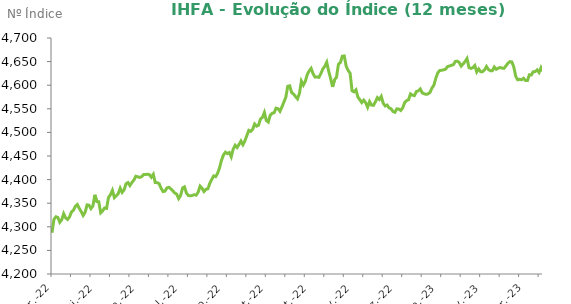
| Category | Series 0 |
|---|---|
| 2022-03-31 | 4287.32 |
| 2022-04-01 | 4315.72 |
| 2022-04-04 | 4321.24 |
| 2022-04-05 | 4319.86 |
| 2022-04-06 | 4309.53 |
| 2022-04-07 | 4315.01 |
| 2022-04-08 | 4327.76 |
| 2022-04-11 | 4318.84 |
| 2022-04-12 | 4315.58 |
| 2022-04-13 | 4320.88 |
| 2022-04-14 | 4331.49 |
| 2022-04-18 | 4335.14 |
| 2022-04-19 | 4343.38 |
| 2022-04-20 | 4347.19 |
| 2022-04-22 | 4339.14 |
| 2022-04-25 | 4332.06 |
| 2022-04-26 | 4324.09 |
| 2022-04-27 | 4330.61 |
| 2022-04-28 | 4346.48 |
| 2022-04-29 | 4345.76 |
| 2022-05-02 | 4338.55 |
| 2022-05-03 | 4344.23 |
| 2022-05-04 | 4367.72 |
| 2022-05-05 | 4353.47 |
| 2022-05-06 | 4353.09 |
| 2022-05-09 | 4329.81 |
| 2022-05-10 | 4333.87 |
| 2022-05-11 | 4339.92 |
| 2022-05-12 | 4339.02 |
| 2022-05-13 | 4362.08 |
| 2022-05-16 | 4367.99 |
| 2022-05-17 | 4377.25 |
| 2022-05-18 | 4361.85 |
| 2022-05-19 | 4365.84 |
| 2022-05-20 | 4370.28 |
| 2022-05-23 | 4381.87 |
| 2022-05-24 | 4372.9 |
| 2022-05-25 | 4378.21 |
| 2022-05-26 | 4391.18 |
| 2022-05-27 | 4393.81 |
| 2022-05-30 | 4387.34 |
| 2022-05-31 | 4393.69 |
| 2022-06-01 | 4398.86 |
| 2022-06-02 | 4407.08 |
| 2022-06-03 | 4405.95 |
| 2022-06-06 | 4404.67 |
| 2022-06-07 | 4406.15 |
| 2022-06-08 | 4410.66 |
| 2022-06-09 | 4410.74 |
| 2022-06-10 | 4411.45 |
| 2022-06-13 | 4410.41 |
| 2022-06-14 | 4404.92 |
| 2022-06-15 | 4411.04 |
| 2022-06-17 | 4393.67 |
| 2022-06-20 | 4393.54 |
| 2022-06-21 | 4391.22 |
| 2022-06-22 | 4381.46 |
| 2022-06-23 | 4374.66 |
| 2022-06-24 | 4375.66 |
| 2022-06-27 | 4382.52 |
| 2022-06-28 | 4383.74 |
| 2022-06-29 | 4380.23 |
| 2022-06-30 | 4376.35 |
| 2022-07-01 | 4371.48 |
| 2022-07-04 | 4369.29 |
| 2022-07-05 | 4359.8 |
| 2022-07-06 | 4366.05 |
| 2022-07-07 | 4382.22 |
| 2022-07-08 | 4384.67 |
| 2022-07-11 | 4371.58 |
| 2022-07-12 | 4366.28 |
| 2022-07-13 | 4365.61 |
| 2022-07-14 | 4366.5 |
| 2022-07-15 | 4367.93 |
| 2022-07-18 | 4366.96 |
| 2022-07-19 | 4373.3 |
| 2022-07-20 | 4386.03 |
| 2022-07-21 | 4381.88 |
| 2022-07-22 | 4374.72 |
| 2022-07-25 | 4379.24 |
| 2022-07-26 | 4380.54 |
| 2022-07-27 | 4392.11 |
| 2022-07-28 | 4400.37 |
| 2022-07-29 | 4407.82 |
| 2022-08-01 | 4406.25 |
| 2022-08-02 | 4413.4 |
| 2022-08-03 | 4425.11 |
| 2022-08-04 | 4441.09 |
| 2022-08-05 | 4452.15 |
| 2022-08-08 | 4458.07 |
| 2022-08-09 | 4454.98 |
| 2022-08-10 | 4457.25 |
| 2022-08-11 | 4448.2 |
| 2022-08-12 | 4464.61 |
| 2022-08-15 | 4472.71 |
| 2022-08-16 | 4468.06 |
| 2022-08-17 | 4474.57 |
| 2022-08-18 | 4481.68 |
| 2022-08-19 | 4473.97 |
| 2022-08-22 | 4482.05 |
| 2022-08-23 | 4493.21 |
| 2022-08-24 | 4504.37 |
| 2022-08-25 | 4502.13 |
| 2022-08-26 | 4506.75 |
| 2022-08-29 | 4517.73 |
| 2022-08-30 | 4513.24 |
| 2022-08-31 | 4515.16 |
| 2022-09-01 | 4528.52 |
| 2022-09-02 | 4531.67 |
| 2022-09-05 | 4542.15 |
| 2022-09-06 | 4525.11 |
| 2022-09-08 | 4521.96 |
| 2022-09-09 | 4536.39 |
| 2022-09-12 | 4540.42 |
| 2022-09-13 | 4541.69 |
| 2022-09-14 | 4551.4 |
| 2022-09-15 | 4550.25 |
| 2022-09-16 | 4544.65 |
| 2022-09-19 | 4553.97 |
| 2022-09-20 | 4564.09 |
| 2022-09-21 | 4574.43 |
| 2022-09-22 | 4597.61 |
| 2022-09-23 | 4598.77 |
| 2022-09-26 | 4584.44 |
| 2022-09-27 | 4581.13 |
| 2022-09-28 | 4575.78 |
| 2022-09-29 | 4571.03 |
| 2022-09-30 | 4582.61 |
| 2022-10-03 | 4608.62 |
| 2022-10-04 | 4600.24 |
| 2022-10-05 | 4608.29 |
| 2022-10-06 | 4622.42 |
| 2022-10-07 | 4630.29 |
| 2022-10-10 | 4635.62 |
| 2022-10-11 | 4624.15 |
| 2022-10-13 | 4617.21 |
| 2022-10-14 | 4617.47 |
| 2022-10-17 | 4616.73 |
| 2022-10-18 | 4624.73 |
| 2022-10-19 | 4634.39 |
| 2022-10-20 | 4640.08 |
| 2022-10-21 | 4648.73 |
| 2022-10-24 | 4629.83 |
| 2022-10-25 | 4614.13 |
| 2022-10-26 | 4596.5 |
| 2022-10-27 | 4611.5 |
| 2022-10-28 | 4616.65 |
| 2022-10-31 | 4644.19 |
| 2022-11-01 | 4648.04 |
| 2022-11-03 | 4661.36 |
| 2022-11-04 | 4661.97 |
| 2022-11-07 | 4640.01 |
| 2022-11-08 | 4631.23 |
| 2022-11-09 | 4625.46 |
| 2022-11-10 | 4588.19 |
| 2022-11-11 | 4585.93 |
| 2022-11-14 | 4590.28 |
| 2022-11-16 | 4574.77 |
| 2022-11-17 | 4569.15 |
| 2022-11-18 | 4563.19 |
| 2022-11-21 | 4568.34 |
| 2022-11-22 | 4562.92 |
| 2022-11-23 | 4553.13 |
| 2022-11-24 | 4565.19 |
| 2022-11-25 | 4557.81 |
| 2022-11-28 | 4557.34 |
| 2022-11-29 | 4564.96 |
| 2022-11-30 | 4573.72 |
| 2022-12-01 | 4569.74 |
| 2022-12-02 | 4576.29 |
| 2022-12-05 | 4561.6 |
| 2022-12-06 | 4556.04 |
| 2022-12-07 | 4557.96 |
| 2022-12-08 | 4551.93 |
| 2022-12-09 | 4550.15 |
| 2022-12-12 | 4544.4 |
| 2022-12-13 | 4542.64 |
| 2022-12-14 | 4549.95 |
| 2022-12-15 | 4549.31 |
| 2022-12-16 | 4546.49 |
| 2022-12-19 | 4552.08 |
| 2022-12-20 | 4563.09 |
| 2022-12-21 | 4567.47 |
| 2022-12-22 | 4569.22 |
| 2022-12-23 | 4581.53 |
| 2022-12-26 | 4578.92 |
| 2022-12-27 | 4577.84 |
| 2022-12-28 | 4586.62 |
| 2022-12-29 | 4588.08 |
| 2022-12-30 | 4592.07 |
| 2023-01-02 | 4583.75 |
| 2023-01-03 | 4581.85 |
| 2023-01-04 | 4580.61 |
| 2023-01-05 | 4581.57 |
| 2023-01-06 | 4584.8 |
| 2023-01-09 | 4593.85 |
| 2023-01-10 | 4600.05 |
| 2023-01-11 | 4614.8 |
| 2023-01-12 | 4626.19 |
| 2023-01-13 | 4631.17 |
| 2023-01-16 | 4631.57 |
| 2023-01-17 | 4632.65 |
| 2023-01-18 | 4633.94 |
| 2023-01-19 | 4639.43 |
| 2023-01-20 | 4640.62 |
| 2023-01-23 | 4642.23 |
| 2023-01-24 | 4643.41 |
| 2023-01-25 | 4650.32 |
| 2023-01-26 | 4650.79 |
| 2023-01-27 | 4648.3 |
| 2023-01-30 | 4640.47 |
| 2023-01-31 | 4645.06 |
| 2023-02-01 | 4650.23 |
| 2023-02-02 | 4656.55 |
| 2023-02-03 | 4637.47 |
| 2023-02-06 | 4635.57 |
| 2023-02-07 | 4637.3 |
| 2023-02-08 | 4641.66 |
| 2023-02-09 | 4628.05 |
| 2023-02-10 | 4634.35 |
| 2023-02-13 | 4628.61 |
| 2023-02-14 | 4628.73 |
| 2023-02-15 | 4632.47 |
| 2023-02-16 | 4639.69 |
| 2023-02-17 | 4633.23 |
| 2023-02-22 | 4630.43 |
| 2023-02-23 | 4630.44 |
| 2023-02-24 | 4638.54 |
| 2023-02-27 | 4633.74 |
| 2023-02-28 | 4636.1 |
| 2023-03-01 | 4637.4 |
| 2023-03-02 | 4636.2 |
| 2023-03-03 | 4635.75 |
| 2023-03-06 | 4641.06 |
| 2023-03-07 | 4646.49 |
| 2023-03-08 | 4649.91 |
| 2023-03-09 | 4649.26 |
| 2023-03-10 | 4638.77 |
| 2023-03-13 | 4618.87 |
| 2023-03-14 | 4611.5 |
| 2023-03-15 | 4612.44 |
| 2023-03-16 | 4611.45 |
| 2023-03-17 | 4614.72 |
| 2023-03-20 | 4610.05 |
| 2023-03-21 | 4609.8 |
| 2023-03-22 | 4621.96 |
| 2023-03-23 | 4621.65 |
| 2023-03-24 | 4628.59 |
| 2023-03-27 | 4628.83 |
| 2023-03-28 | 4632.45 |
| 2023-03-29 | 4626.97 |
| 2023-03-30 | 4637.12 |
| 2023-03-31 | 4629.22 |